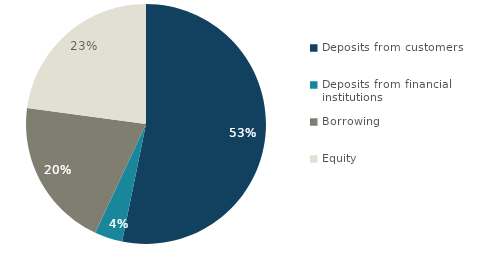
| Category | Series 0 |
|---|---|
| Deposits from customers | 583715 |
| Deposits from financial institutions | 41307 |
| Borrowing | 221207 |
| Equity | 251146 |